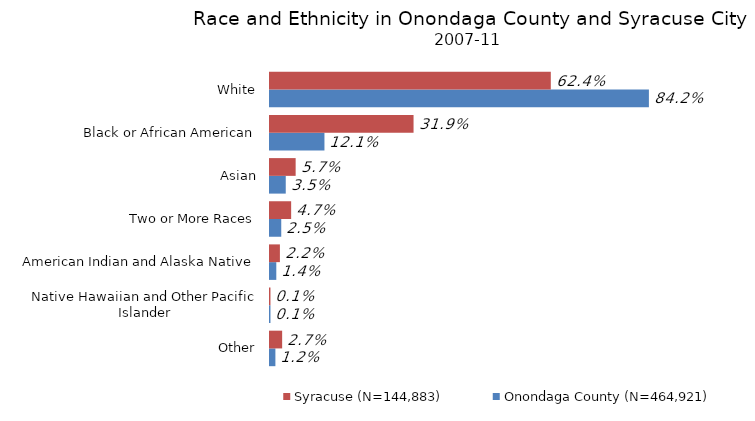
| Category | Onondaga County (N=464,921) | Syracuse (N=144,883) |
|---|---|---|
| Other | 0.012 | 0.027 |
| Native Hawaiian and Other Pacific Islander | 0.001 | 0.001 |
| American Indian and Alaska Native | 0.014 | 0.022 |
| Two or More Races | 0.025 | 0.047 |
| Asian | 0.035 | 0.057 |
| Black or African American | 0.121 | 0.319 |
| White | 0.842 | 0.624 |